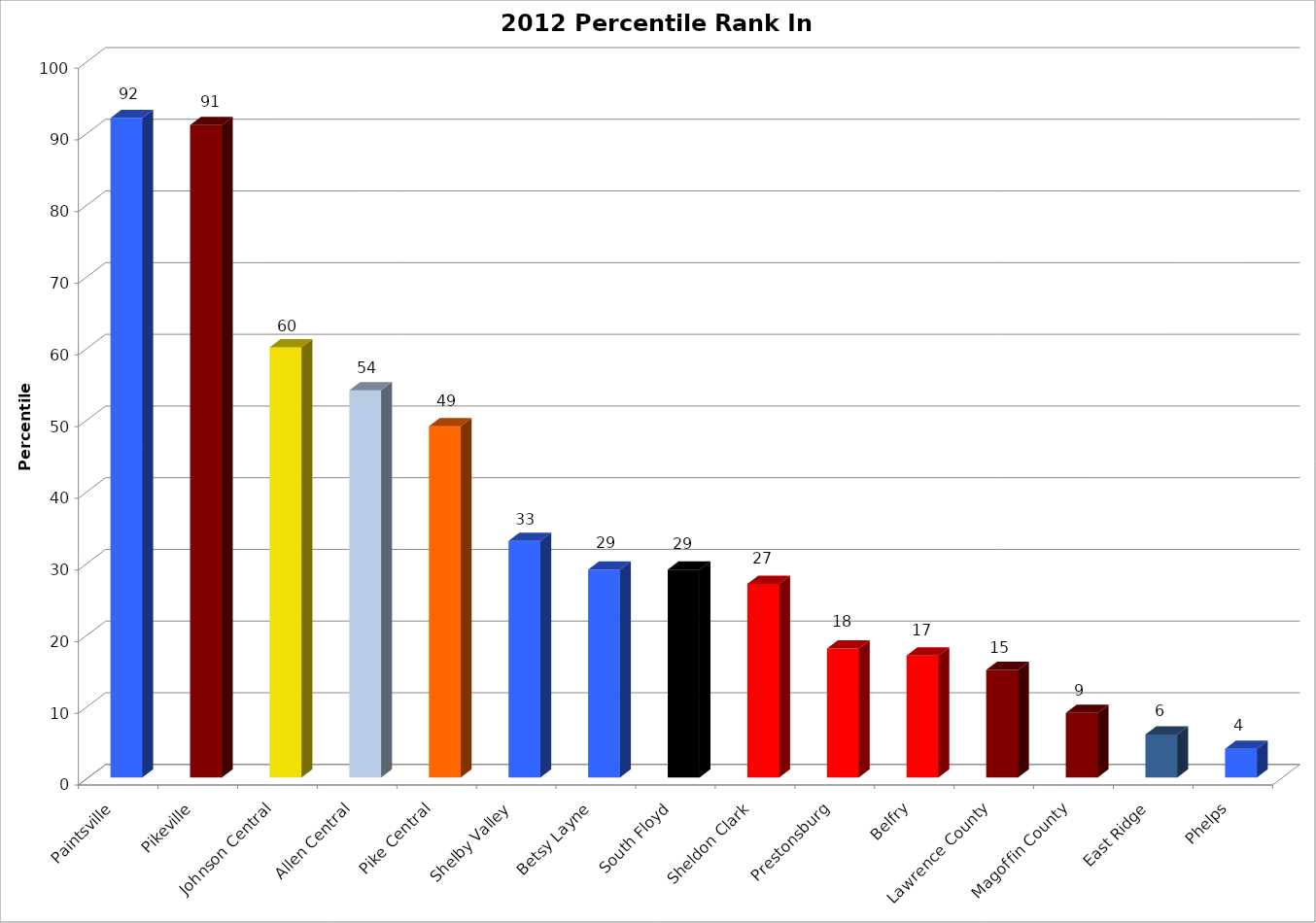
| Category | Series 0 |
|---|---|
| Paintsville | 92 |
| Pikeville | 91 |
| Johnson Central | 60 |
| Allen Central | 54 |
| Pike Central | 49 |
| Shelby Valley | 33 |
| Betsy Layne | 29 |
| South Floyd | 29 |
| Sheldon Clark | 27 |
| Prestonsburg | 18 |
| Belfry | 17 |
| Lawrence County | 15 |
| Magoffin County | 9 |
| East Ridge | 6 |
| Phelps | 4 |